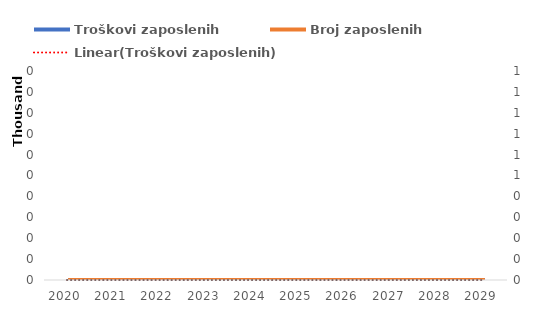
| Category | Troškovi zaposlenih |
|---|---|
| 2020.0 | 0 |
| 2021.0 | 0 |
| 2022.0 | 0 |
| 2023.0 | 0 |
| 2024.0 | 0 |
| 2025.0 | 0 |
| 2026.0 | 0 |
| 2027.0 | 0 |
| 2028.0 | 0 |
| 2029.0 | 0 |